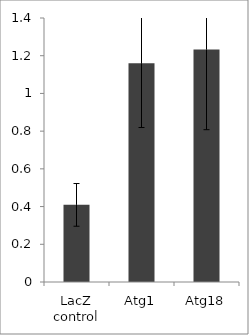
| Category | Series 0 |
|---|---|
| LacZ control | 0.409 |
| Atg1 | 1.16 |
| Atg18 | 1.234 |